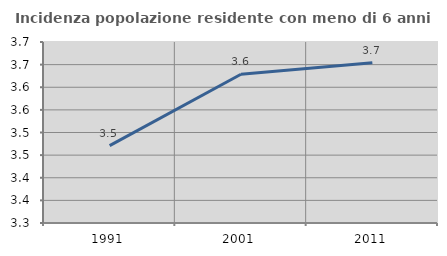
| Category | Incidenza popolazione residente con meno di 6 anni |
|---|---|
| 1991.0 | 3.471 |
| 2001.0 | 3.629 |
| 2011.0 | 3.654 |